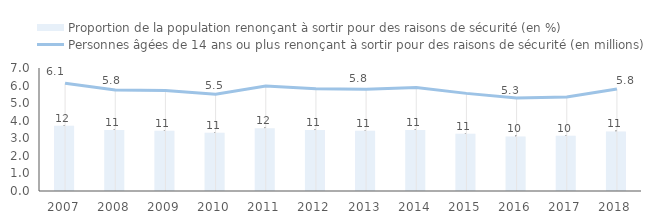
| Category | Proportion de la population renonçant à sortir pour des raisons de sécurité (en %) |
|---|---|
| 2007.0 | 12.18 |
| 2008.0 | 11.42 |
| 2009.0 | 11.27 |
| 2010.0 | 10.9 |
| 2011.0 | 11.75 |
| 2012.0 | 11.4 |
| 2013.0 | 11.27 |
| 2014.0 | 11.41 |
| 2015.0 | 10.72 |
| 2016.0 | 10.21 |
| 2017.0 | 10.33 |
| 2018.0 | 11.13 |